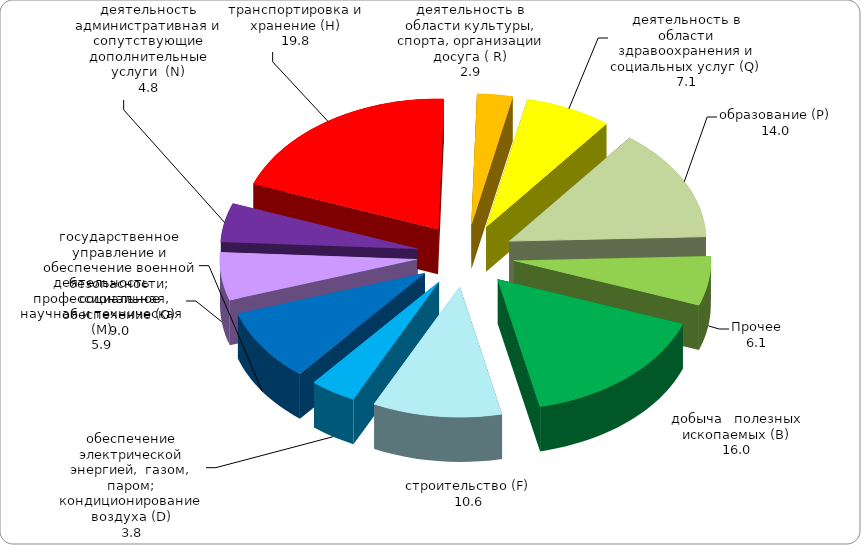
| Category | Series 3 | Series 2 | Series 1 | Series 0 |
|---|---|---|---|---|
|     добыча   полезных    ископаемых (В) | 16 |  |  |  |
| строительство (F) | 10.6 |  |  |  |
| обеспечение электрической энергией,  газом, паром; кондиционирование воздуха (D) | 3.8 |  |  |  |
| государственное управление и обеспечение военной безопасности; социальное обеспечение (О) | 9 |  |  |  |
| деятельность профессиональная, научная и техническая (М) | 5.9 |  |  |  |
| деятельность административная и сопутствующие дополнительные услуги  (N) | 4.8 |  |  |  |
| транспортировка и хранение (H) | 19.8 |  |  |  |
| деятельность в области культуры, спорта, организации досуга ( R) | 2.9 |  |  |  |
| деятельность в области здравоохранения и социальных услуг (Q) | 7.1 |  |  |  |
| образование (Р) | 14 |  |  |  |
| Прочее | 6.1 |  |  |  |